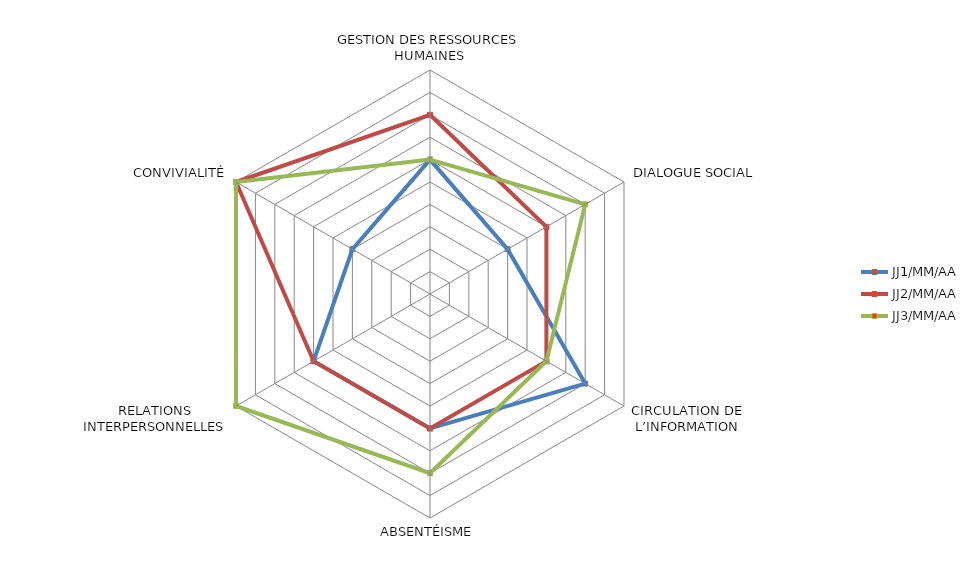
| Category | JJ1/MM/AA | JJ2/MM/AA | JJ3/MM/AA |
|---|---|---|---|
| GESTION DES RESSOURCES HUMAINES | 6 | 8 | 6 |
|  DIALOGUE SOCIAL | 4 | 6 | 8 |
| CIRCULATION DE L’INFORMATION | 8 | 6 | 6 |
| ABSENTÉISME | 6 | 6 | 8 |
| RELATIONS INTERPERSONNELLES | 6 | 6 | 10 |
| CONVIVIALITÉ | 4 | 10 | 10 |